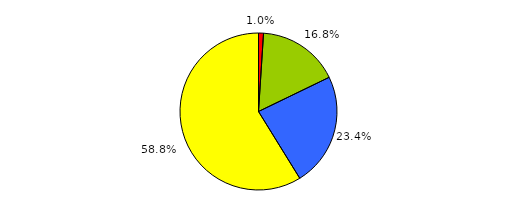
| Category | Series 0 |
|---|---|
| 0 | 5 |
| 1 | 82 |
| 2 | 114 |
| 3 | 287 |